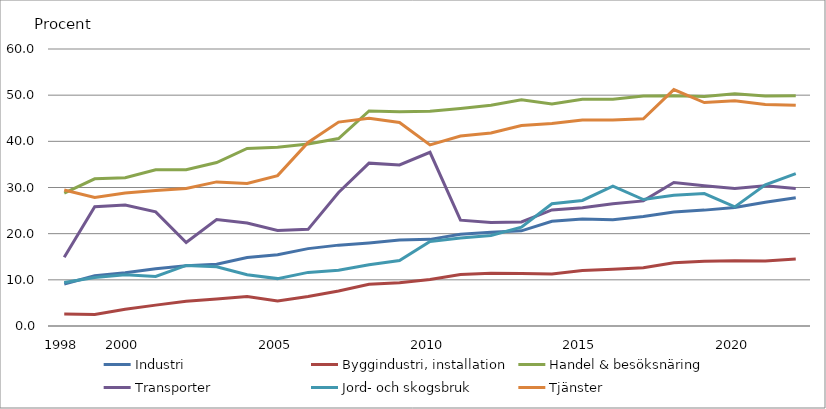
| Category | Industri | Byggindustri, installation | Handel & besöksnäring | Transporter | Jord- och skogsbruk | Tjänster |
|---|---|---|---|---|---|---|
| 1998.0 | 9.103 | 2.618 | 28.793 | 14.876 | 9.406 | 29.467 |
| nan | 10.882 | 2.478 | 31.88 | 25.833 | 10.526 | 27.829 |
| 2000.0 | 11.531 | 3.609 | 32.13 | 26.198 | 11.089 | 28.794 |
| nan | 12.394 | 4.523 | 33.826 | 24.722 | 10.737 | 29.328 |
| nan | 13.029 | 5.356 | 33.848 | 18.095 | 13.115 | 29.798 |
| nan | 13.39 | 5.838 | 35.41 | 23.055 | 12.81 | 31.215 |
| nan | 14.853 | 6.397 | 38.467 | 22.293 | 11.091 | 30.856 |
| 2005.0 | 15.439 | 5.423 | 38.708 | 20.676 | 10.265 | 32.577 |
| nan | 16.762 | 6.379 | 39.419 | 20.936 | 11.613 | 39.764 |
| nan | 17.517 | 7.566 | 40.608 | 28.923 | 12.057 | 44.161 |
| nan | 18 | 9.042 | 46.58 | 35.276 | 13.266 | 44.998 |
| nan | 18.602 | 9.388 | 46.407 | 34.877 | 14.196 | 44.085 |
| 2010.0 | 18.764 | 10.071 | 46.525 | 37.624 | 18.314 | 39.238 |
| nan | 19.88 | 11.141 | 47.126 | 22.929 | 19.073 | 41.139 |
| nan | 20.302 | 11.442 | 47.826 | 22.446 | 19.596 | 41.808 |
| nan | 20.607 | 11.355 | 48.986 | 22.544 | 21.39 | 43.422 |
| nan | 22.689 | 11.249 | 48.091 | 25.136 | 26.475 | 43.857 |
| 2015.0 | 23.2 | 12 | 49.1 | 25.6 | 27.2 | 44.6 |
| nan | 23 | 12.3 | 49.1 | 26.5 | 30.3 | 44.6 |
| nan | 23.7 | 12.6 | 49.8 | 27.1 | 27.4 | 44.9 |
| nan | 24.7 | 13.7 | 49.9 | 31.1 | 28.3 | 51.2 |
| nan | 25.1 | 14 | 49.7 | 30.4 | 28.7 | 48.4 |
| 2020.0 | 25.681 | 14.138 | 50.3 | 29.8 | 25.8 | 48.8 |
| nan | 26.8 | 14.1 | 49.8 | 30.4 | 30.6 | 48 |
| nan | 27.8 | 14.5 | 49.9 | 29.8 | 33 | 47.8 |